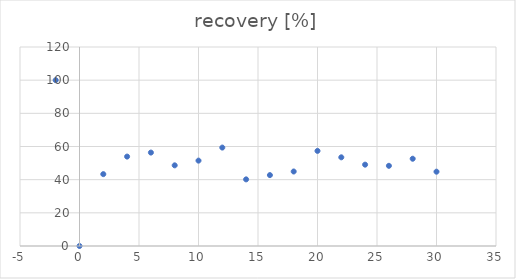
| Category | recovery [%] |
|---|---|
| -2.0 | 100 |
| 0.0 | 0 |
| 2.0 | 43.332 |
| 4.0 | 53.915 |
| 6.0 | 56.336 |
| 8.0 | 48.642 |
| 10.0 | 51.48 |
| 12.0 | 59.354 |
| 14.0 | 40.181 |
| 16.0 | 42.75 |
| 18.0 | 44.926 |
| 20.0 | 57.348 |
| 22.0 | 53.479 |
| 24.0 | 49.051 |
| 26.0 | 48.35 |
| 28.0 | 52.62 |
| 30.0 | 44.813 |